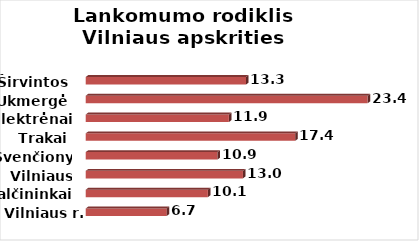
| Category | Series 0 |
|---|---|
| Vilniaus r. | 6.728 |
| Šalčininkai | 10.138 |
| Vilniaus m. | 13.048 |
| Švenčionys | 10.931 |
| Trakai | 17.386 |
| Elektrėnai | 11.881 |
| Ukmergė | 23.395 |
| Širvintos | 13.303 |